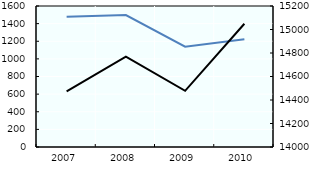
| Category | IRPP |
|---|---|
| 2007.0 | 1479.085 |
| 2008.0 | 1497.637 |
| 2009.0 | 1138.243 |
| 2010.0 | 1223.218 |